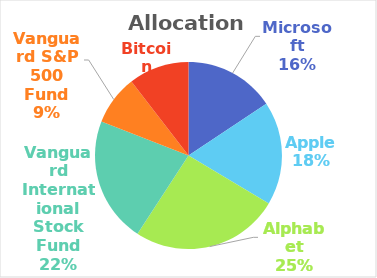
| Category | Series 0 |
|---|---|
| Microsoft | 1652213.51 |
| Apple | 1893855.04 |
| Alphabet | 2704462.86 |
| Vanguard International Stock Fund | 2297310.36 |
| Vanguard S&P 500 Fund | 910175.64 |
| Bitcoin | 1103815.08 |